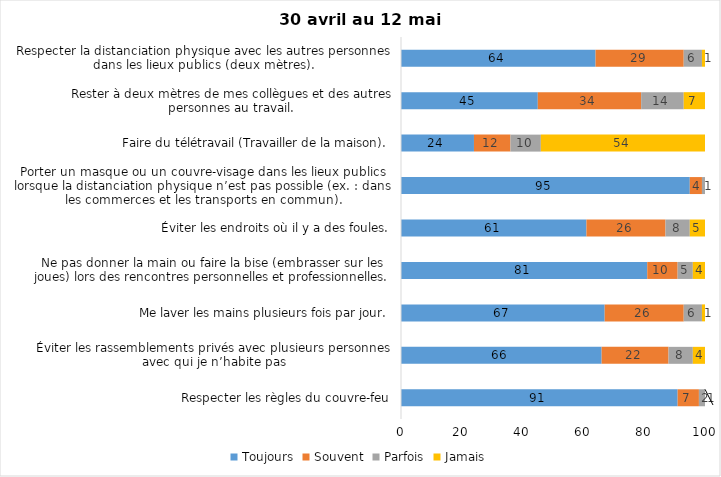
| Category | Toujours | Souvent | Parfois | Jamais |
|---|---|---|---|---|
| Respecter les règles du couvre-feu | 91 | 7 | 2 | 1 |
| Éviter les rassemblements privés avec plusieurs personnes avec qui je n’habite pas | 66 | 22 | 8 | 4 |
| Me laver les mains plusieurs fois par jour. | 67 | 26 | 6 | 1 |
| Ne pas donner la main ou faire la bise (embrasser sur les joues) lors des rencontres personnelles et professionnelles. | 81 | 10 | 5 | 4 |
| Éviter les endroits où il y a des foules. | 61 | 26 | 8 | 5 |
| Porter un masque ou un couvre-visage dans les lieux publics lorsque la distanciation physique n’est pas possible (ex. : dans les commerces et les transports en commun). | 95 | 4 | 1 | 0 |
| Faire du télétravail (Travailler de la maison). | 24 | 12 | 10 | 54 |
| Rester à deux mètres de mes collègues et des autres personnes au travail. | 45 | 34 | 14 | 7 |
| Respecter la distanciation physique avec les autres personnes dans les lieux publics (deux mètres). | 64 | 29 | 6 | 1 |